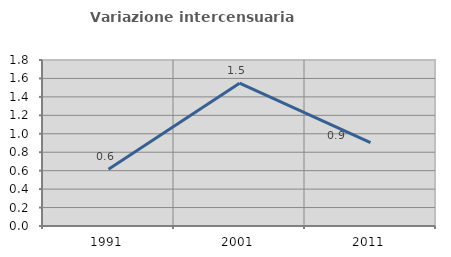
| Category | Variazione intercensuaria annua |
|---|---|
| 1991.0 | 0.616 |
| 2001.0 | 1.549 |
| 2011.0 | 0.903 |